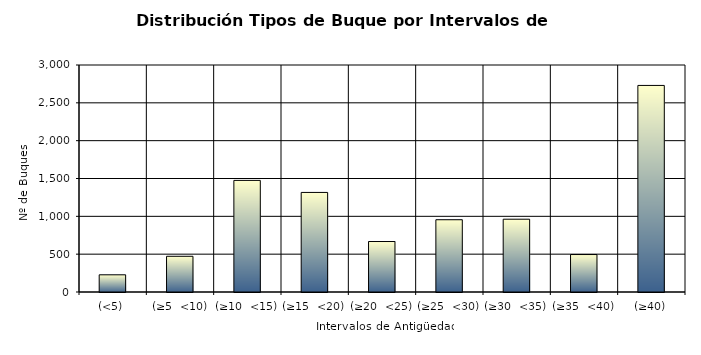
| Category | Series 0 |
|---|---|
| (<5) | 227 |
| (≥5  <10) | 472 |
| (≥10  <15) | 1475 |
| (≥15  <20) | 1316 |
| (≥20  <25) | 667 |
| (≥25  <30) | 955 |
| (≥30  <35) | 962 |
| (≥35  <40) | 495 |
| (≥40) | 2730 |